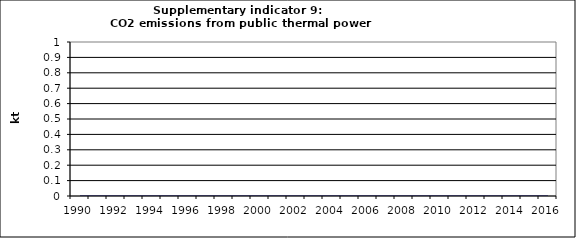
| Category | CO2 emissions from public thermal power stations, kt |
|---|---|
| 1990 | 0 |
| 1991 | 0 |
| 1992 | 0 |
| 1993 | 0 |
| 1994 | 0 |
| 1995 | 0 |
| 1996 | 0 |
| 1997 | 0 |
| 1998 | 0 |
| 1999 | 0 |
| 2000 | 0 |
| 2001 | 0 |
| 2002 | 0 |
| 2003 | 0 |
| 2004 | 0 |
| 2005 | 0 |
| 2006 | 0 |
| 2007 | 0 |
| 2008 | 0 |
| 2009 | 0 |
| 2010 | 0 |
| 2011 | 0 |
| 2012 | 0 |
| 2013 | 0 |
| 2014 | 0 |
| 2015 | 0 |
| 2016 | 0 |